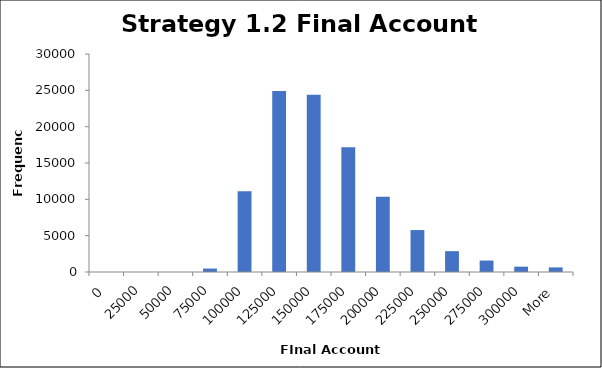
| Category | Frequency |
|---|---|
| 0 | 0 |
| 25000 | 0 |
| 50000 | 1 |
| 75000 | 469 |
| 100000 | 11096 |
| 125000 | 24907 |
| 150000 | 24409 |
| 175000 | 17182 |
| 200000 | 10359 |
| 225000 | 5770 |
| 250000 | 2867 |
| 275000 | 1575 |
| 300000 | 734 |
| More | 633 |